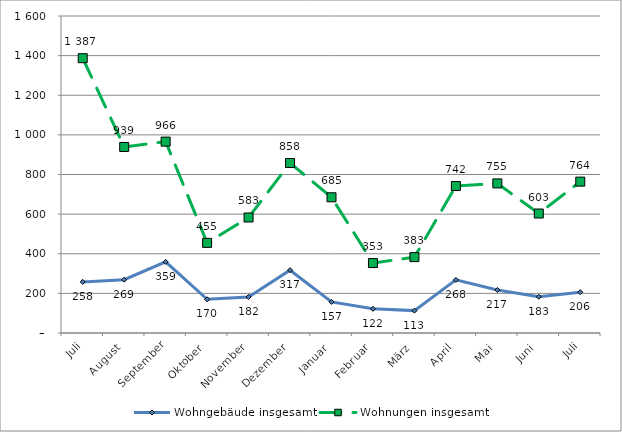
| Category | Wohngebäude insgesamt | Wohnungen insgesamt |
|---|---|---|
| Juli | 258 | 1387 |
| August | 269 | 939 |
| September | 359 | 966 |
| Oktober | 170 | 455 |
| November | 182 | 583 |
| Dezember | 317 | 858 |
| Januar | 157 | 685 |
| Februar | 122 | 353 |
| März | 113 | 383 |
| April | 268 | 742 |
| Mai | 217 | 755 |
| Juni | 183 | 603 |
| Juli | 206 | 764 |